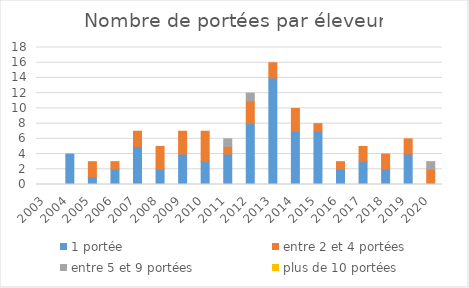
| Category | 1 portée | entre 2 et 4 portées | entre 5 et 9 portées | plus de 10 portées |
|---|---|---|---|---|
| 2003.0 | 0 | 0 | 0 | 0 |
| 2004.0 | 4 | 0 | 0 | 0 |
| 2005.0 | 1 | 2 | 0 | 0 |
| 2006.0 | 2 | 1 | 0 | 0 |
| 2007.0 | 5 | 2 | 0 | 0 |
| 2008.0 | 2 | 3 | 0 | 0 |
| 2009.0 | 4 | 3 | 0 | 0 |
| 2010.0 | 3 | 4 | 0 | 0 |
| 2011.0 | 4 | 1 | 1 | 0 |
| 2012.0 | 8 | 3 | 1 | 0 |
| 2013.0 | 14 | 2 | 0 | 0 |
| 2014.0 | 7 | 3 | 0 | 0 |
| 2015.0 | 7 | 1 | 0 | 0 |
| 2016.0 | 2 | 1 | 0 | 0 |
| 2017.0 | 3 | 2 | 0 | 0 |
| 2018.0 | 2 | 2 | 0 | 0 |
| 2019.0 | 4 | 2 | 0 | 0 |
| 2020.0 | 0 | 2 | 1 | 0 |